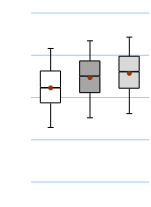
| Category | 25th | 50th | 75th |
|---|---|---|---|
| UK | 46.537 | 9.091 | 10.065 |
| Top 50% | 52.597 | 9.848 | 9.199 |
| Top 10% | 55.199 | 9.953 | 9.258 |